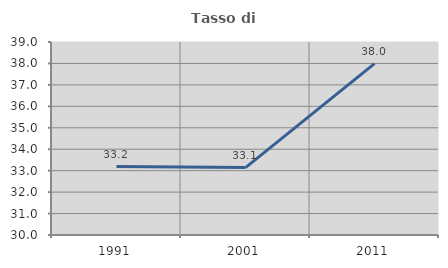
| Category | Tasso di occupazione   |
|---|---|
| 1991.0 | 33.189 |
| 2001.0 | 33.144 |
| 2011.0 | 37.994 |